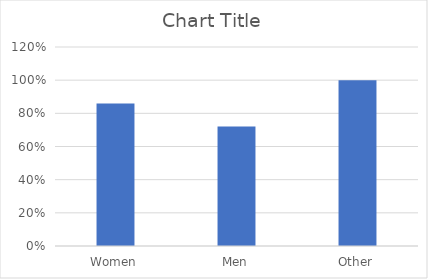
| Category | Series 0 |
|---|---|
| Women | 0.86 |
| Men | 0.72 |
| Other | 1 |